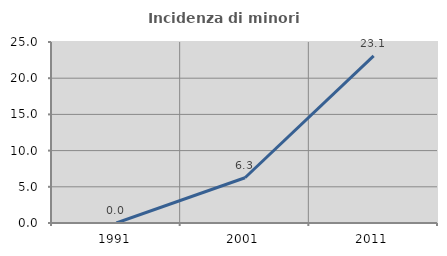
| Category | Incidenza di minori stranieri |
|---|---|
| 1991.0 | 0 |
| 2001.0 | 6.25 |
| 2011.0 | 23.077 |